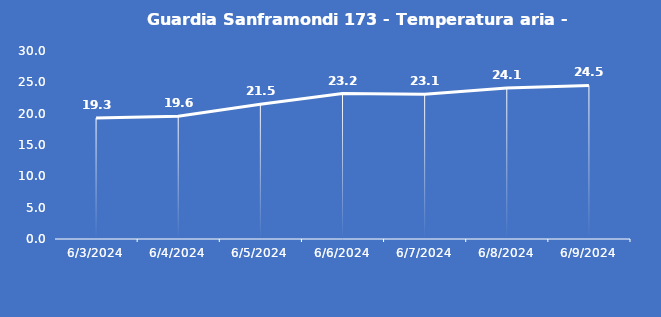
| Category | Guardia Sanframondi 173 - Temperatura aria - Grezzo (°C) |
|---|---|
| 6/3/24 | 19.3 |
| 6/4/24 | 19.6 |
| 6/5/24 | 21.5 |
| 6/6/24 | 23.2 |
| 6/7/24 | 23.1 |
| 6/8/24 | 24.1 |
| 6/9/24 | 24.5 |